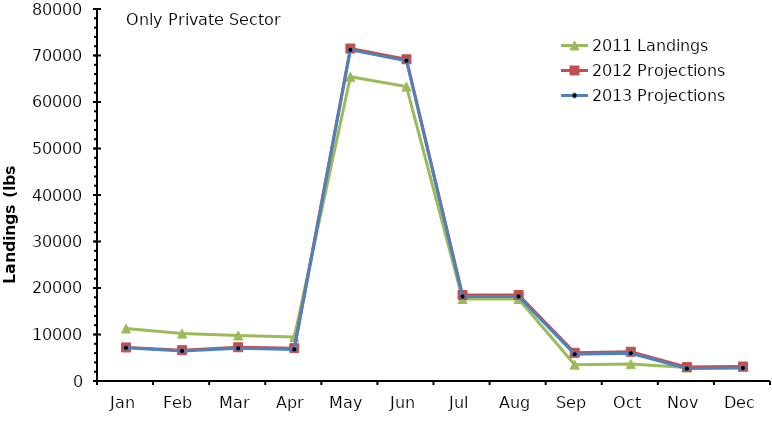
| Category | 2011 Landings | 2012 Projections | 2013 Projections |
|---|---|---|---|
| Jan | 11284.905 | 7217.584 | 7151.073 |
| Feb | 10192.818 | 6621.895 | 6455.559 |
| Mar | 9783.797 | 7258.499 | 7029.486 |
| Apr | 9468.19 | 7066.907 | 6799.609 |
| May | 65417.165 | 71498.072 | 71207.39 |
| Jun | 63306.934 | 69193.202 | 68888.236 |
| Jul | 17635.584 | 18492.846 | 18175.319 |
| Aug | 17635.584 | 18502.407 | 18179.924 |
| Sep | 3514.613 | 6068.247 | 5745.973 |
| Oct | 3631.766 | 6298.21 | 5973.948 |
| Nov | 2914.483 | 2991.044 | 2665.567 |
| Dec | 3011.632 | 3115.911 | 2789.692 |